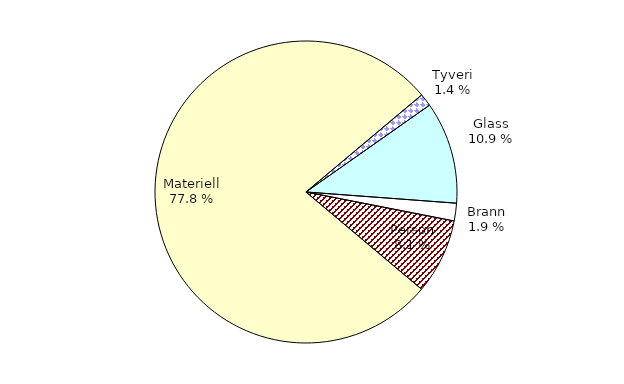
| Category | Series 0 |
|---|---|
| Tyveri | 153.672 |
| Glass | 1237.723 |
| Brann | 214.208 |
| Person | 911.722 |
| Materiell | 8800.298 |